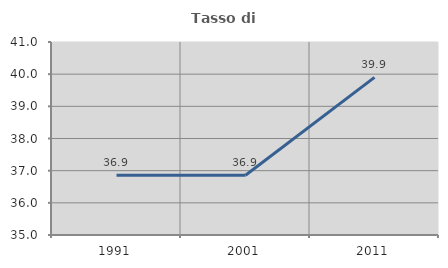
| Category | Tasso di occupazione   |
|---|---|
| 1991.0 | 36.854 |
| 2001.0 | 36.86 |
| 2011.0 | 39.901 |